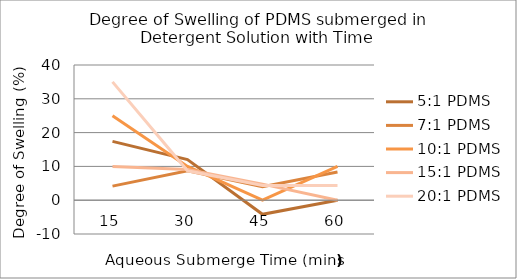
| Category | 5:1 PDMS | 7:1 PDMS | 10:1 PDMS | 15:1 PDMS | 20:1 PDMS |
|---|---|---|---|---|---|
| 0 | 17.391 | 4.167 | 25 | 10 | 35 |
| 1 | 12 | 8.696 | 10 | 9.091 | 8.696 |
| 2 | -4.167 | 4 | 0 | 4.762 | 4.348 |
| 3 | 0 | 8.333 | 10 | 0 | 4.348 |